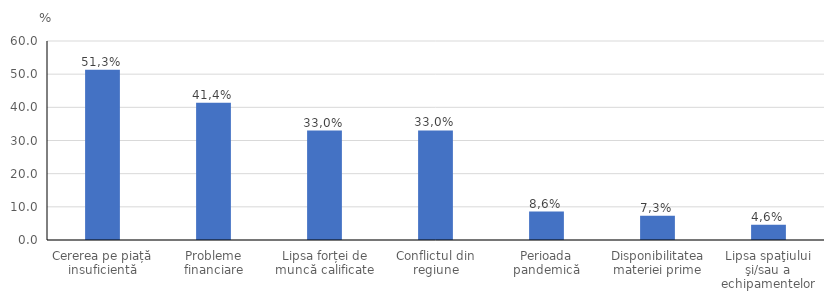
| Category | Series 0 |
|---|---|
| Cererea pe piață insuficientă | 51.333 |
| Probleme financiare | 41.358 |
| Lipsa forței de muncă calificate | 32.99 |
| Conflictul din regiune | 33.026 |
| Perioada pandemică | 8.58 |
| Disponibilitatea materiei prime | 7.297 |
| Lipsa spaţiului şi/sau a echipamentelor | 4.61 |